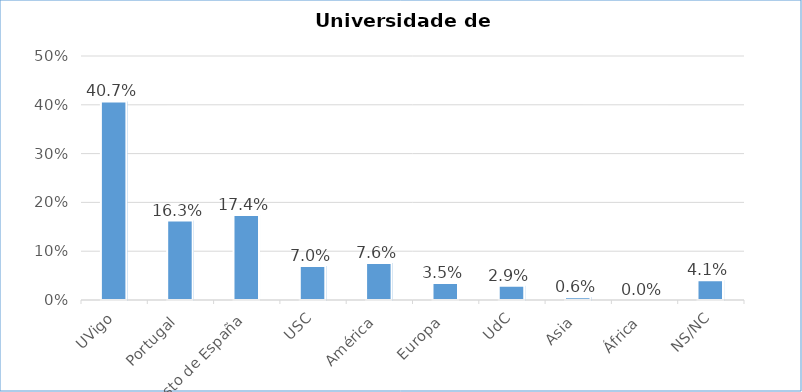
| Category | % Respostas |
|---|---|
| UVigo | 0.407 |
| Portugal | 0.163 |
| Resto de España | 0.174 |
| USC | 0.07 |
| América | 0.076 |
| Europa | 0.035 |
| UdC | 0.029 |
| Asia | 0.006 |
| África | 0 |
| NS/NC | 0.041 |